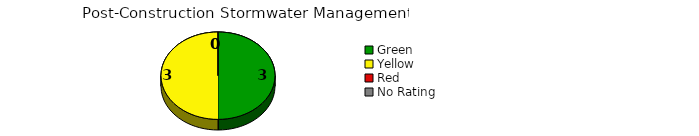
| Category | Counts |
|---|---|
| Green | 3 |
| Yellow | 3 |
| Red | 0 |
| No Rating | 0 |